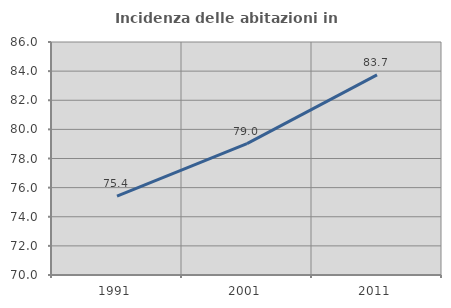
| Category | Incidenza delle abitazioni in proprietà  |
|---|---|
| 1991.0 | 75.411 |
| 2001.0 | 79.024 |
| 2011.0 | 83.747 |